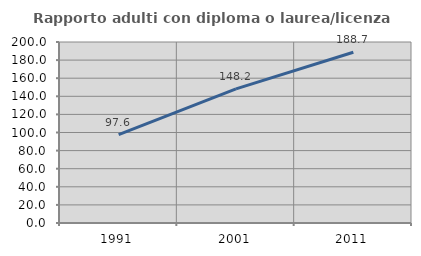
| Category | Rapporto adulti con diploma o laurea/licenza media  |
|---|---|
| 1991.0 | 97.627 |
| 2001.0 | 148.224 |
| 2011.0 | 188.708 |